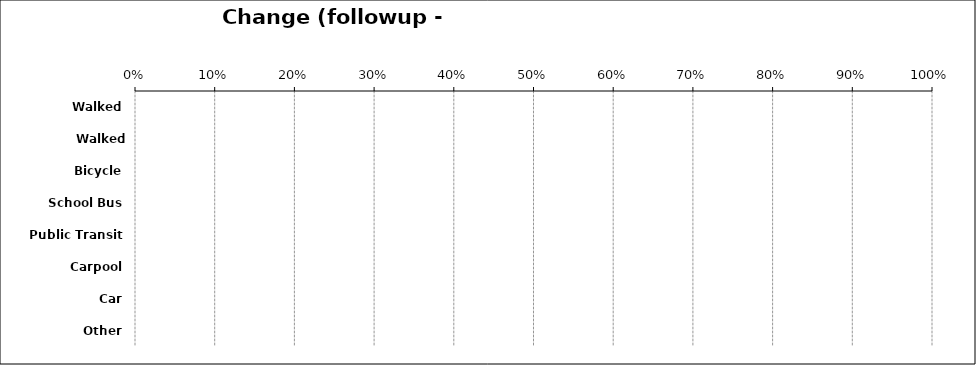
| Category | Change (followup - baseline) |
|---|---|
| Walked | 0 |
| Walked part-way | 0 |
| Bicycle | 0 |
| School Bus | 0 |
| Public Transit | 0 |
| Carpool | 0 |
| Car | 0 |
| Other | 0 |